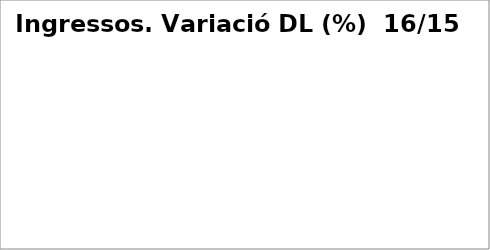
| Category | Series 0 |
|---|---|
| Impostos directes | 0.034 |
| Impostos indirectes | 0.134 |
| Taxes, preus públics i altres ingressos | 0.03 |
| Transferències corrents | -0.099 |
| Ingressos patrimonials | -0.056 |
| Venda d'inversions reals | -0.232 |
| Transferències de capital | -0.08 |
| Actius financers* | -0.991 |
| Passius financers | 1.036 |